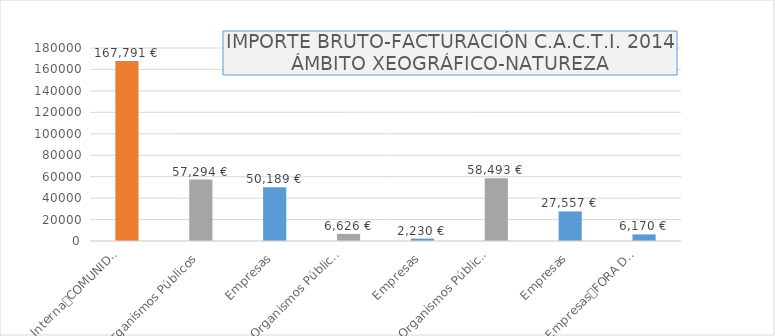
| Category | Series 0 |
|---|---|
| 0 | 167791.24 |
| 1 | 57294.09 |
| 2 | 50188.69 |
| 3 | 6626.45 |
| 4 | 2230 |
| 5 | 58493.1 |
| 6 | 27557 |
| 7 | 6169.6 |